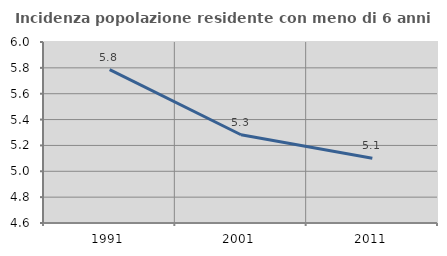
| Category | Incidenza popolazione residente con meno di 6 anni |
|---|---|
| 1991.0 | 5.786 |
| 2001.0 | 5.283 |
| 2011.0 | 5.1 |